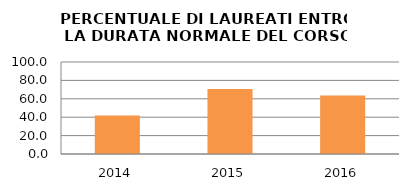
| Category | 2014 2015 2016 |
|---|---|
| 2014.0 | 41.935 |
| 2015.0 | 70.732 |
| 2016.0 | 63.462 |